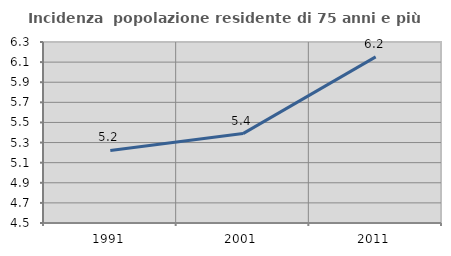
| Category | Incidenza  popolazione residente di 75 anni e più |
|---|---|
| 1991.0 | 5.222 |
| 2001.0 | 5.389 |
| 2011.0 | 6.152 |